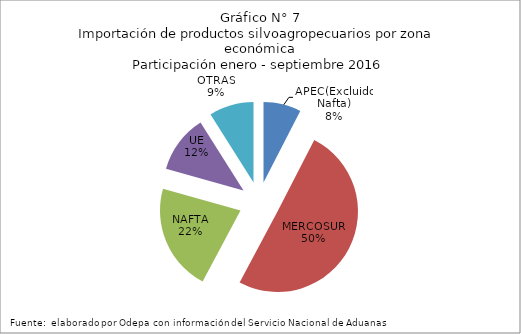
| Category | Series 0 |
|---|---|
| APEC(Excluido Nafta) | 285149.517 |
| MERCOSUR | 1897766.777 |
| NAFTA | 813886.561 |
| UE | 441607.279 |
| OTRAS | 338481.865 |